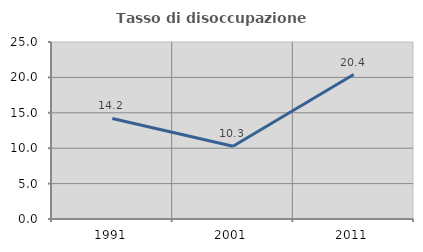
| Category | Tasso di disoccupazione giovanile  |
|---|---|
| 1991.0 | 14.201 |
| 2001.0 | 10.286 |
| 2011.0 | 20.408 |